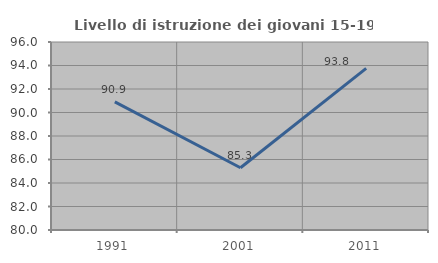
| Category | Livello di istruzione dei giovani 15-19 anni |
|---|---|
| 1991.0 | 90.909 |
| 2001.0 | 85.294 |
| 2011.0 | 93.75 |